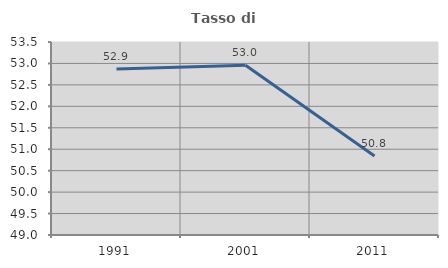
| Category | Tasso di occupazione   |
|---|---|
| 1991.0 | 52.869 |
| 2001.0 | 52.959 |
| 2011.0 | 50.841 |